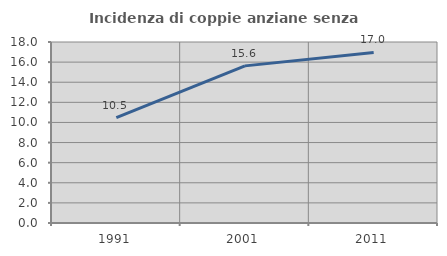
| Category | Incidenza di coppie anziane senza figli  |
|---|---|
| 1991.0 | 10.476 |
| 2001.0 | 15.625 |
| 2011.0 | 16.964 |